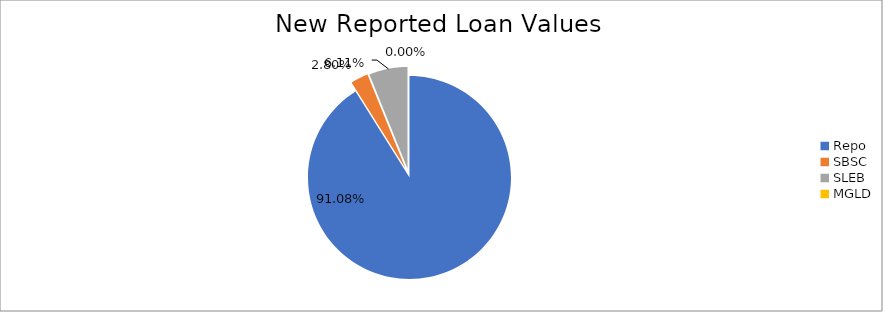
| Category | Series 0 |
|---|---|
| Repo | 9452770.669 |
| SBSC | 291057.558 |
| SLEB | 634608.444 |
| MGLD | 219.189 |